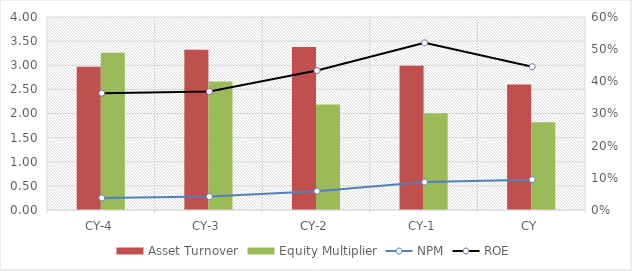
| Category | Asset Turnover | Equity Multiplier |
|---|---|---|
| CY-4 | 2.967 | 3.261 |
| CY-3 | 3.322 | 2.662 |
| CY-2 | 3.38 | 2.188 |
| CY-1 | 2.989 | 2.004 |
| CY | 2.599 | 1.818 |